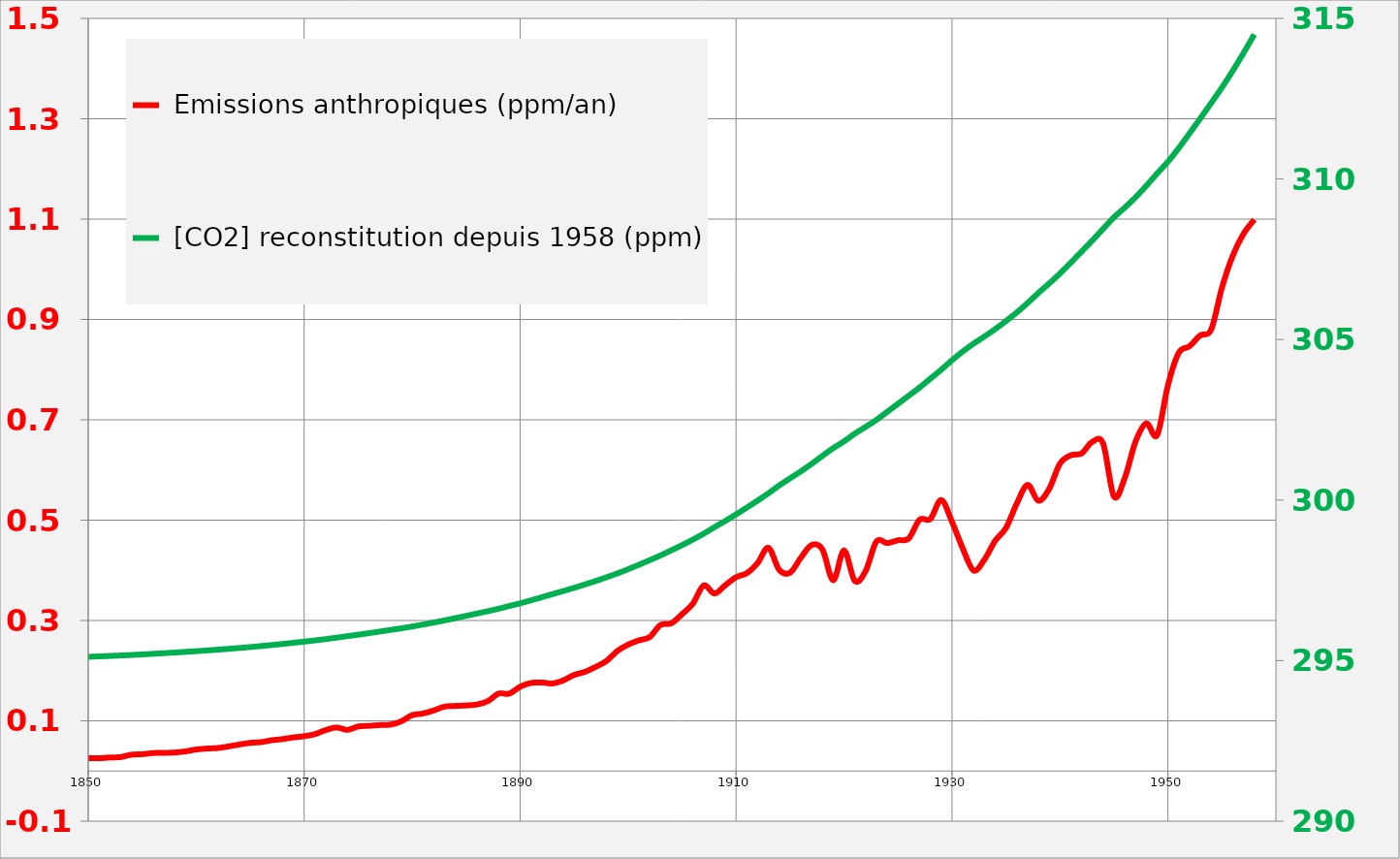
| Category |  Emissions anthropiques (ppm/an) |
|---|---|
| 1850.0 | 0.025 |
| 1851.0 | 0.025 |
| 1852.0 | 0.027 |
| 1853.0 | 0.028 |
| 1854.0 | 0.033 |
| 1855.0 | 0.033 |
| 1856.0 | 0.036 |
| 1857.0 | 0.036 |
| 1858.0 | 0.037 |
| 1859.0 | 0.039 |
| 1860.0 | 0.043 |
| 1861.0 | 0.045 |
| 1862.0 | 0.046 |
| 1863.0 | 0.049 |
| 1864.0 | 0.053 |
| 1865.0 | 0.056 |
| 1866.0 | 0.058 |
| 1867.0 | 0.061 |
| 1868.0 | 0.064 |
| 1869.0 | 0.067 |
| 1870.0 | 0.069 |
| 1871.0 | 0.074 |
| 1872.0 | 0.082 |
| 1873.0 | 0.087 |
| 1874.0 | 0.082 |
| 1875.0 | 0.089 |
| 1876.0 | 0.09 |
| 1877.0 | 0.092 |
| 1878.0 | 0.092 |
| 1879.0 | 0.099 |
| 1880.0 | 0.111 |
| 1881.0 | 0.115 |
| 1882.0 | 0.121 |
| 1883.0 | 0.128 |
| 1884.0 | 0.13 |
| 1885.0 | 0.131 |
| 1886.0 | 0.133 |
| 1887.0 | 0.139 |
| 1888.0 | 0.154 |
| 1889.0 | 0.154 |
| 1890.0 | 0.168 |
| 1891.0 | 0.175 |
| 1892.0 | 0.176 |
| 1893.0 | 0.175 |
| 1894.0 | 0.181 |
| 1895.0 | 0.192 |
| 1896.0 | 0.198 |
| 1897.0 | 0.208 |
| 1898.0 | 0.219 |
| 1899.0 | 0.239 |
| 1900.0 | 0.252 |
| 1901.0 | 0.26 |
| 1902.0 | 0.267 |
| 1903.0 | 0.291 |
| 1904.0 | 0.294 |
| 1905.0 | 0.313 |
| 1906.0 | 0.333 |
| 1907.0 | 0.37 |
| 1908.0 | 0.354 |
| 1909.0 | 0.37 |
| 1910.0 | 0.386 |
| 1911.0 | 0.394 |
| 1912.0 | 0.415 |
| 1913.0 | 0.445 |
| 1914.0 | 0.401 |
| 1915.0 | 0.395 |
| 1916.0 | 0.425 |
| 1917.0 | 0.45 |
| 1918.0 | 0.442 |
| 1919.0 | 0.38 |
| 1920.0 | 0.44 |
| 1921.0 | 0.379 |
| 1922.0 | 0.399 |
| 1923.0 | 0.458 |
| 1924.0 | 0.454 |
| 1925.0 | 0.46 |
| 1926.0 | 0.464 |
| 1927.0 | 0.501 |
| 1928.0 | 0.502 |
| 1929.0 | 0.54 |
| 1930.0 | 0.497 |
| 1931.0 | 0.443 |
| 1932.0 | 0.4 |
| 1933.0 | 0.421 |
| 1934.0 | 0.459 |
| 1935.0 | 0.484 |
| 1936.0 | 0.533 |
| 1937.0 | 0.57 |
| 1938.0 | 0.539 |
| 1939.0 | 0.562 |
| 1940.0 | 0.613 |
| 1941.0 | 0.629 |
| 1942.0 | 0.633 |
| 1943.0 | 0.656 |
| 1944.0 | 0.652 |
| 1945.0 | 0.547 |
| 1946.0 | 0.584 |
| 1947.0 | 0.657 |
| 1948.0 | 0.693 |
| 1949.0 | 0.669 |
| 1950.0 | 0.769 |
| 1951.0 | 0.833 |
| 1952.0 | 0.847 |
| 1953.0 | 0.868 |
| 1954.0 | 0.88 |
| 1955.0 | 0.963 |
| 1956.0 | 1.027 |
| 1957.0 | 1.071 |
| 1958.0 | 1.099 |